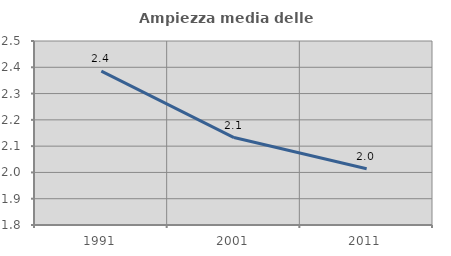
| Category | Ampiezza media delle famiglie |
|---|---|
| 1991.0 | 2.385 |
| 2001.0 | 2.133 |
| 2011.0 | 2.014 |